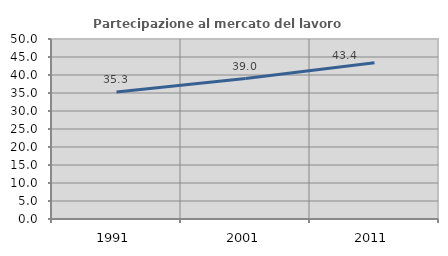
| Category | Partecipazione al mercato del lavoro  femminile |
|---|---|
| 1991.0 | 35.308 |
| 2001.0 | 39.018 |
| 2011.0 | 43.387 |